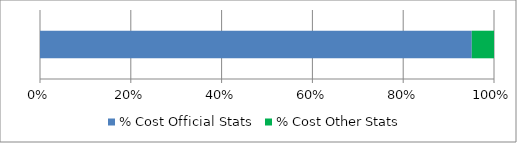
| Category | % Cost Official Stats | % Cost Other Stats |
|---|---|---|
| 0 | 0.951 | 0.049 |